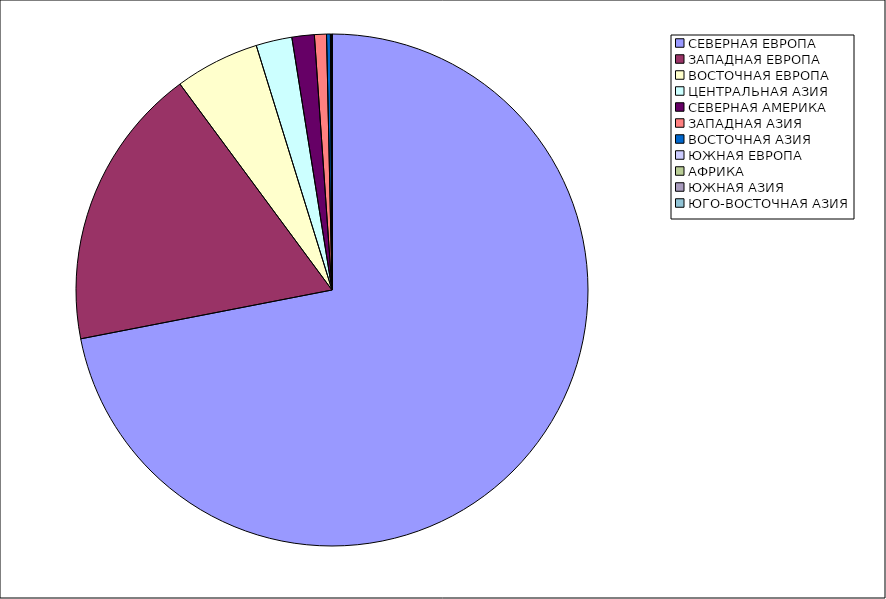
| Category | Оборот |
|---|---|
| СЕВЕРНАЯ ЕВРОПА | 71.93 |
| ЗАПАДНАЯ ЕВРОПА | 17.93 |
| ВОСТОЧНАЯ ЕВРОПА | 5.34 |
| ЦЕНТРАЛЬНАЯ АЗИЯ | 2.27 |
| СЕВЕРНАЯ АМЕРИКА | 1.41 |
| ЗАПАДНАЯ АЗИЯ | 0.76 |
| ВОСТОЧНАЯ АЗИЯ | 0.24 |
| ЮЖНАЯ ЕВРОПА | 0.08 |
| АФРИКА | 0.02 |
| ЮЖНАЯ АЗИЯ | 0 |
| ЮГО-ВОСТОЧНАЯ АЗИЯ | 0 |